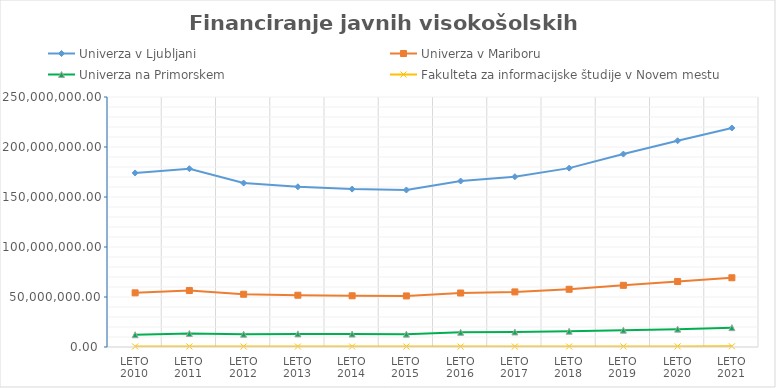
| Category | Univerza v Ljubljani | Univerza v Mariboru | Univerza na Primorskem | Fakulteta za informacijske študije v Novem mestu |
|---|---|---|---|---|
| Leto 2010 | 174047955.4 | 54151779.81 | 12265433.52 | 542045.88 |
| Leto 2011 | 178308196.56 | 56438714.14 | 13501865.29 | 546924.29 |
| Leto 2012 | 163953074.69 | 52755631.79 | 12757187.4 | 492545.17 |
| Leto 2013 | 160208615.12 | 51784421.1 | 13124419.39 | 469950.58 |
| Leto 2014 | 157902565.15 | 51215985.41 | 12935505.91 | 463186.09 |
| Leto 2015 | 156988375.02 | 51073478.7 | 12860614.71 | 460504.44 |
| Leto 2016 | 165943794.94 | 53986903.35 | 14687477.35 | 437479.22 |
| Leto 2017 | 170276074.91 | 55090748.94 | 15016514.71 | 466980.46 |
| Leto 2018 | 178870369.21 | 57728660.4 | 15762227.38 | 498991.17 |
| Leto 2019 | 192936021.39 | 61685487.76 | 16829458.57 | 558642.44 |
| Leto 2020 | 206263159.24 | 65456388.12 | 17873004.03 | 622063.66 |
| Leto 2021 | 219007369.69 | 69230060.63 | 19348281.58 | 693400.57 |